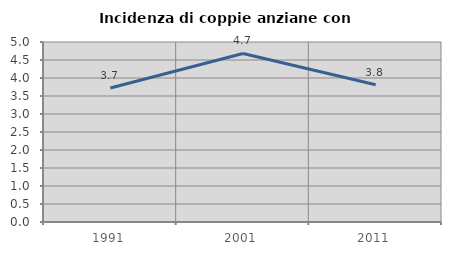
| Category | Incidenza di coppie anziane con figli |
|---|---|
| 1991.0 | 3.722 |
| 2001.0 | 4.682 |
| 2011.0 | 3.814 |